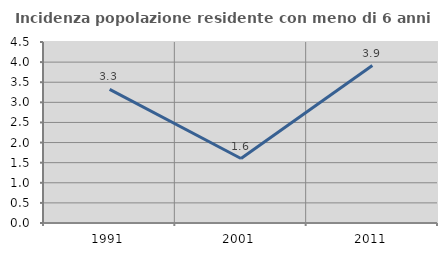
| Category | Incidenza popolazione residente con meno di 6 anni |
|---|---|
| 1991.0 | 3.323 |
| 2001.0 | 1.603 |
| 2011.0 | 3.916 |